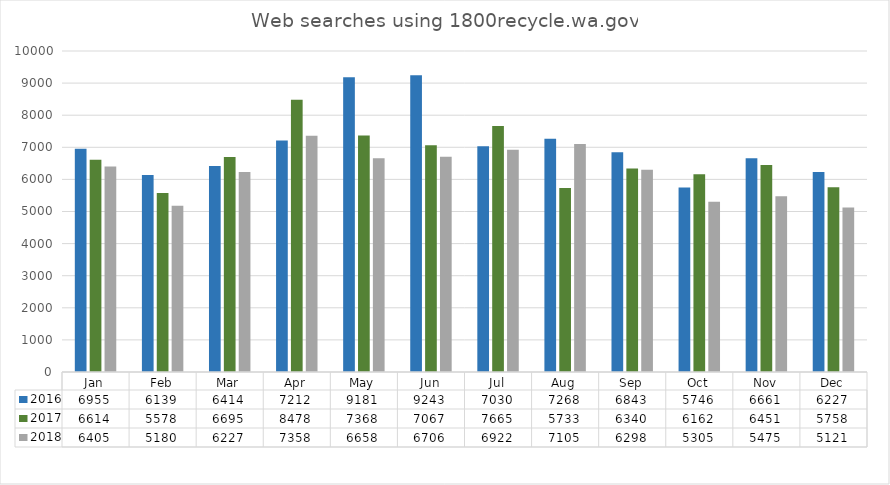
| Category | 2016 | 2017 | 2018 |
|---|---|---|---|
| Jan | 6955 | 6614 | 6405 |
| Feb | 6139 | 5578 | 5180 |
| Mar | 6414 | 6695 | 6227 |
| Apr | 7212 | 8478 | 7358 |
| May | 9181 | 7368 | 6658 |
| Jun | 9243 | 7067 | 6706 |
| Jul | 7030 | 7665 | 6922 |
| Aug | 7268 | 5733 | 7105 |
| Sep | 6843 | 6340 | 6298 |
| Oct | 5746 | 6162 | 5305 |
| Nov | 6661 | 6451 | 5475 |
| Dec | 6227 | 5758 | 5121 |